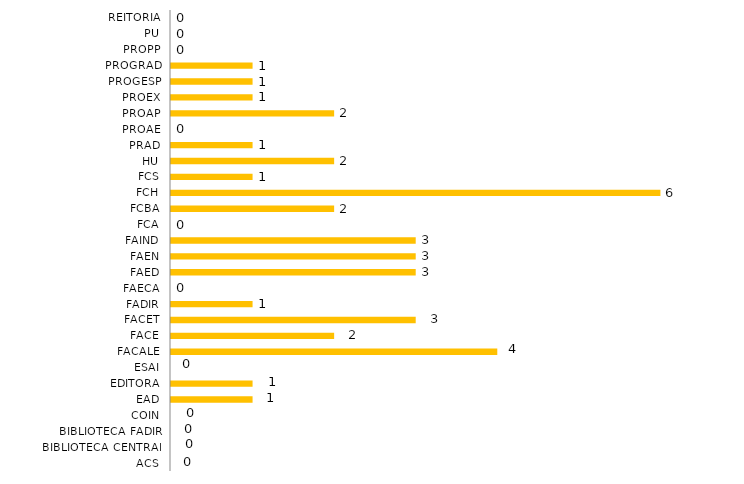
| Category | Lotação/Ano |
|---|---|
| ACS | 0 |
| BIBLIOTECA CENTRAL | 0 |
| BIBLIOTECA FADIR | 0 |
| COIN | 0 |
| EAD | 1 |
| EDITORA | 1 |
| ESAI | 0 |
| FACALE | 4 |
| FACE | 2 |
| FACET | 3 |
| FADIR | 1 |
| FAECA | 0 |
| FAED | 3 |
| FAEN | 3 |
| FAIND | 3 |
| FCA | 0 |
| FCBA | 2 |
| FCH | 6 |
| FCS | 1 |
| HU | 2 |
| PRAD | 1 |
| PROAE | 0 |
| PROAP | 2 |
| PROEX | 1 |
| PROGESP | 1 |
| PROGRAD | 1 |
| PROPP | 0 |
| PU | 0 |
| REITORIA | 0 |